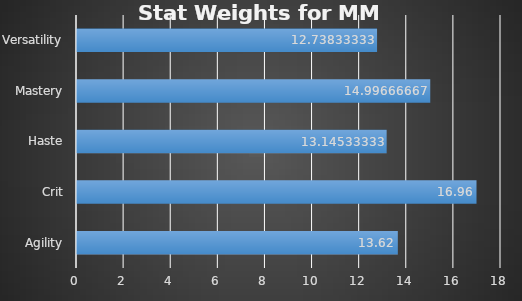
| Category | Series 0 |
|---|---|
| Agility | 13.62 |
| Crit | 16.96 |
| Haste | 13.145 |
| Mastery | 14.997 |
| Versatility | 12.738 |